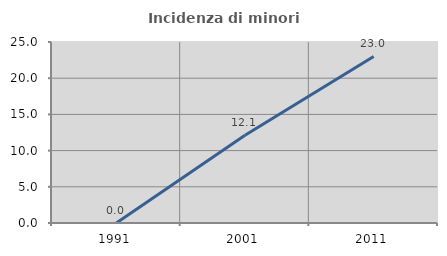
| Category | Incidenza di minori stranieri |
|---|---|
| 1991.0 | 0 |
| 2001.0 | 12.121 |
| 2011.0 | 23.009 |